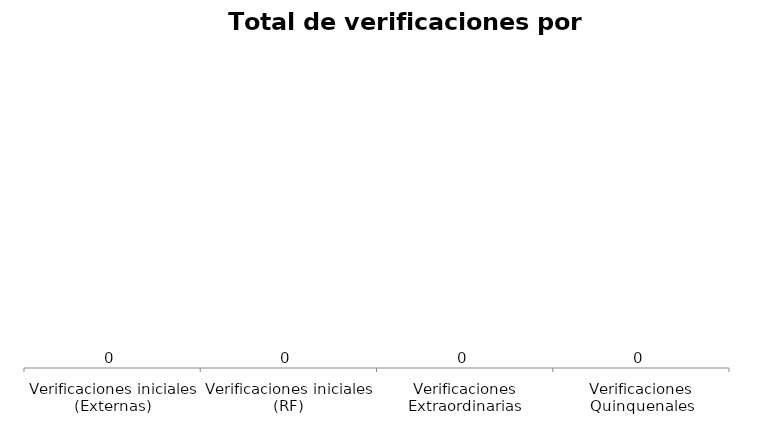
| Category | Series 1 |
|---|---|
| Verificaciones iniciales (Externas) | 0 |
| Verificaciones iniciales (RF) | 0 |
| Verificaciones Extraordinarias | 0 |
| Verificaciones Quinquenales | 0 |